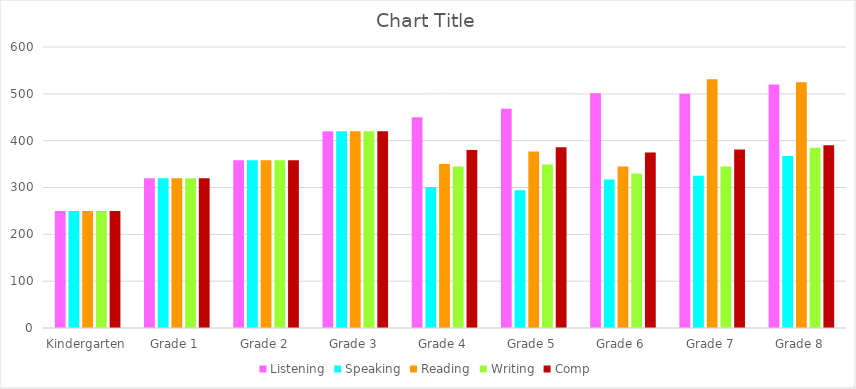
| Category | Listening | Speaking | Reading | Writing | Comp |
|---|---|---|---|---|---|
| Kindergarten | 250 | 250 | 250 | 250 | 250 |
| Grade 1 | 320 | 320 | 320 | 320 | 320 |
| Grade 2 | 358 | 358 | 358 | 358 | 358 |
| Grade 3 | 420 | 420 | 420 | 420 | 420 |
| Grade 4 | 450 | 301 | 350 | 345 | 380 |
| Grade 5 | 468 | 294 | 377 | 349 | 386 |
| Grade 6 | 501 | 317 | 345 | 330 | 375 |
| Grade 7 | 500 | 325 | 531 | 345 | 381 |
| Grade 8 | 520 | 367 | 525 | 385 | 390 |